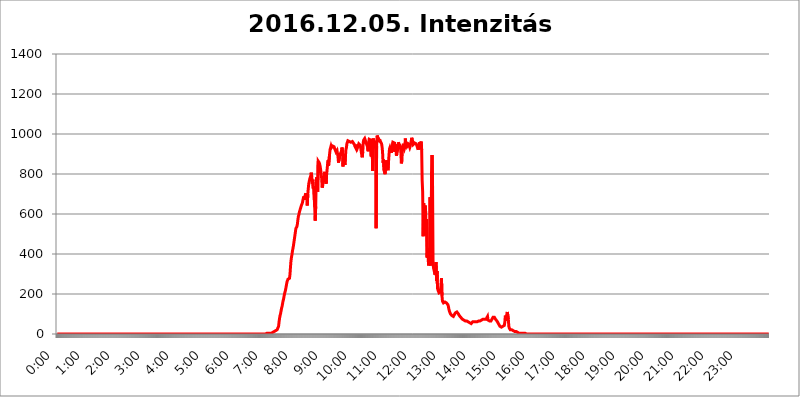
| Category | 2016.12.05. Intenzitás [W/m^2] |
|---|---|
| 0.0 | 0 |
| 0.0006944444444444445 | 0 |
| 0.001388888888888889 | 0 |
| 0.0020833333333333333 | 0 |
| 0.002777777777777778 | 0 |
| 0.003472222222222222 | 0 |
| 0.004166666666666667 | 0 |
| 0.004861111111111111 | 0 |
| 0.005555555555555556 | 0 |
| 0.0062499999999999995 | 0 |
| 0.006944444444444444 | 0 |
| 0.007638888888888889 | 0 |
| 0.008333333333333333 | 0 |
| 0.009027777777777779 | 0 |
| 0.009722222222222222 | 0 |
| 0.010416666666666666 | 0 |
| 0.011111111111111112 | 0 |
| 0.011805555555555555 | 0 |
| 0.012499999999999999 | 0 |
| 0.013194444444444444 | 0 |
| 0.013888888888888888 | 0 |
| 0.014583333333333332 | 0 |
| 0.015277777777777777 | 0 |
| 0.015972222222222224 | 0 |
| 0.016666666666666666 | 0 |
| 0.017361111111111112 | 0 |
| 0.018055555555555557 | 0 |
| 0.01875 | 0 |
| 0.019444444444444445 | 0 |
| 0.02013888888888889 | 0 |
| 0.020833333333333332 | 0 |
| 0.02152777777777778 | 0 |
| 0.022222222222222223 | 0 |
| 0.02291666666666667 | 0 |
| 0.02361111111111111 | 0 |
| 0.024305555555555556 | 0 |
| 0.024999999999999998 | 0 |
| 0.025694444444444447 | 0 |
| 0.02638888888888889 | 0 |
| 0.027083333333333334 | 0 |
| 0.027777777777777776 | 0 |
| 0.02847222222222222 | 0 |
| 0.029166666666666664 | 0 |
| 0.029861111111111113 | 0 |
| 0.030555555555555555 | 0 |
| 0.03125 | 0 |
| 0.03194444444444445 | 0 |
| 0.03263888888888889 | 0 |
| 0.03333333333333333 | 0 |
| 0.034027777777777775 | 0 |
| 0.034722222222222224 | 0 |
| 0.035416666666666666 | 0 |
| 0.036111111111111115 | 0 |
| 0.03680555555555556 | 0 |
| 0.0375 | 0 |
| 0.03819444444444444 | 0 |
| 0.03888888888888889 | 0 |
| 0.03958333333333333 | 0 |
| 0.04027777777777778 | 0 |
| 0.04097222222222222 | 0 |
| 0.041666666666666664 | 0 |
| 0.042361111111111106 | 0 |
| 0.04305555555555556 | 0 |
| 0.043750000000000004 | 0 |
| 0.044444444444444446 | 0 |
| 0.04513888888888889 | 0 |
| 0.04583333333333334 | 0 |
| 0.04652777777777778 | 0 |
| 0.04722222222222222 | 0 |
| 0.04791666666666666 | 0 |
| 0.04861111111111111 | 0 |
| 0.049305555555555554 | 0 |
| 0.049999999999999996 | 0 |
| 0.05069444444444445 | 0 |
| 0.051388888888888894 | 0 |
| 0.052083333333333336 | 0 |
| 0.05277777777777778 | 0 |
| 0.05347222222222222 | 0 |
| 0.05416666666666667 | 0 |
| 0.05486111111111111 | 0 |
| 0.05555555555555555 | 0 |
| 0.05625 | 0 |
| 0.05694444444444444 | 0 |
| 0.057638888888888885 | 0 |
| 0.05833333333333333 | 0 |
| 0.05902777777777778 | 0 |
| 0.059722222222222225 | 0 |
| 0.06041666666666667 | 0 |
| 0.061111111111111116 | 0 |
| 0.06180555555555556 | 0 |
| 0.0625 | 0 |
| 0.06319444444444444 | 0 |
| 0.06388888888888888 | 0 |
| 0.06458333333333334 | 0 |
| 0.06527777777777778 | 0 |
| 0.06597222222222222 | 0 |
| 0.06666666666666667 | 0 |
| 0.06736111111111111 | 0 |
| 0.06805555555555555 | 0 |
| 0.06874999999999999 | 0 |
| 0.06944444444444443 | 0 |
| 0.07013888888888889 | 0 |
| 0.07083333333333333 | 0 |
| 0.07152777777777779 | 0 |
| 0.07222222222222223 | 0 |
| 0.07291666666666667 | 0 |
| 0.07361111111111111 | 0 |
| 0.07430555555555556 | 0 |
| 0.075 | 0 |
| 0.07569444444444444 | 0 |
| 0.0763888888888889 | 0 |
| 0.07708333333333334 | 0 |
| 0.07777777777777778 | 0 |
| 0.07847222222222222 | 0 |
| 0.07916666666666666 | 0 |
| 0.0798611111111111 | 0 |
| 0.08055555555555556 | 0 |
| 0.08125 | 0 |
| 0.08194444444444444 | 0 |
| 0.08263888888888889 | 0 |
| 0.08333333333333333 | 0 |
| 0.08402777777777777 | 0 |
| 0.08472222222222221 | 0 |
| 0.08541666666666665 | 0 |
| 0.08611111111111112 | 0 |
| 0.08680555555555557 | 0 |
| 0.08750000000000001 | 0 |
| 0.08819444444444445 | 0 |
| 0.08888888888888889 | 0 |
| 0.08958333333333333 | 0 |
| 0.09027777777777778 | 0 |
| 0.09097222222222222 | 0 |
| 0.09166666666666667 | 0 |
| 0.09236111111111112 | 0 |
| 0.09305555555555556 | 0 |
| 0.09375 | 0 |
| 0.09444444444444444 | 0 |
| 0.09513888888888888 | 0 |
| 0.09583333333333333 | 0 |
| 0.09652777777777777 | 0 |
| 0.09722222222222222 | 0 |
| 0.09791666666666667 | 0 |
| 0.09861111111111111 | 0 |
| 0.09930555555555555 | 0 |
| 0.09999999999999999 | 0 |
| 0.10069444444444443 | 0 |
| 0.1013888888888889 | 0 |
| 0.10208333333333335 | 0 |
| 0.10277777777777779 | 0 |
| 0.10347222222222223 | 0 |
| 0.10416666666666667 | 0 |
| 0.10486111111111111 | 0 |
| 0.10555555555555556 | 0 |
| 0.10625 | 0 |
| 0.10694444444444444 | 0 |
| 0.1076388888888889 | 0 |
| 0.10833333333333334 | 0 |
| 0.10902777777777778 | 0 |
| 0.10972222222222222 | 0 |
| 0.1111111111111111 | 0 |
| 0.11180555555555556 | 0 |
| 0.11180555555555556 | 0 |
| 0.1125 | 0 |
| 0.11319444444444444 | 0 |
| 0.11388888888888889 | 0 |
| 0.11458333333333333 | 0 |
| 0.11527777777777777 | 0 |
| 0.11597222222222221 | 0 |
| 0.11666666666666665 | 0 |
| 0.1173611111111111 | 0 |
| 0.11805555555555557 | 0 |
| 0.11944444444444445 | 0 |
| 0.12013888888888889 | 0 |
| 0.12083333333333333 | 0 |
| 0.12152777777777778 | 0 |
| 0.12222222222222223 | 0 |
| 0.12291666666666667 | 0 |
| 0.12291666666666667 | 0 |
| 0.12361111111111112 | 0 |
| 0.12430555555555556 | 0 |
| 0.125 | 0 |
| 0.12569444444444444 | 0 |
| 0.12638888888888888 | 0 |
| 0.12708333333333333 | 0 |
| 0.16875 | 0 |
| 0.12847222222222224 | 0 |
| 0.12916666666666668 | 0 |
| 0.12986111111111112 | 0 |
| 0.13055555555555556 | 0 |
| 0.13125 | 0 |
| 0.13194444444444445 | 0 |
| 0.1326388888888889 | 0 |
| 0.13333333333333333 | 0 |
| 0.13402777777777777 | 0 |
| 0.13402777777777777 | 0 |
| 0.13472222222222222 | 0 |
| 0.13541666666666666 | 0 |
| 0.1361111111111111 | 0 |
| 0.13749999999999998 | 0 |
| 0.13819444444444443 | 0 |
| 0.1388888888888889 | 0 |
| 0.13958333333333334 | 0 |
| 0.14027777777777778 | 0 |
| 0.14097222222222222 | 0 |
| 0.14166666666666666 | 0 |
| 0.1423611111111111 | 0 |
| 0.14305555555555557 | 0 |
| 0.14375000000000002 | 0 |
| 0.14444444444444446 | 0 |
| 0.1451388888888889 | 0 |
| 0.1451388888888889 | 0 |
| 0.14652777777777778 | 0 |
| 0.14722222222222223 | 0 |
| 0.14791666666666667 | 0 |
| 0.1486111111111111 | 0 |
| 0.14930555555555555 | 0 |
| 0.15 | 0 |
| 0.15069444444444444 | 0 |
| 0.15138888888888888 | 0 |
| 0.15208333333333332 | 0 |
| 0.15277777777777776 | 0 |
| 0.15347222222222223 | 0 |
| 0.15416666666666667 | 0 |
| 0.15486111111111112 | 0 |
| 0.15555555555555556 | 0 |
| 0.15625 | 0 |
| 0.15694444444444444 | 0 |
| 0.15763888888888888 | 0 |
| 0.15833333333333333 | 0 |
| 0.15902777777777777 | 0 |
| 0.15972222222222224 | 0 |
| 0.16041666666666668 | 0 |
| 0.16111111111111112 | 0 |
| 0.16180555555555556 | 0 |
| 0.1625 | 0 |
| 0.16319444444444445 | 0 |
| 0.1638888888888889 | 0 |
| 0.16458333333333333 | 0 |
| 0.16527777777777777 | 0 |
| 0.16597222222222222 | 0 |
| 0.16666666666666666 | 0 |
| 0.1673611111111111 | 0 |
| 0.16805555555555554 | 0 |
| 0.16874999999999998 | 0 |
| 0.16944444444444443 | 0 |
| 0.17013888888888887 | 0 |
| 0.1708333333333333 | 0 |
| 0.17152777777777775 | 0 |
| 0.17222222222222225 | 0 |
| 0.1729166666666667 | 0 |
| 0.17361111111111113 | 0 |
| 0.17430555555555557 | 0 |
| 0.17500000000000002 | 0 |
| 0.17569444444444446 | 0 |
| 0.1763888888888889 | 0 |
| 0.17708333333333334 | 0 |
| 0.17777777777777778 | 0 |
| 0.17847222222222223 | 0 |
| 0.17916666666666667 | 0 |
| 0.1798611111111111 | 0 |
| 0.18055555555555555 | 0 |
| 0.18125 | 0 |
| 0.18194444444444444 | 0 |
| 0.1826388888888889 | 0 |
| 0.18333333333333335 | 0 |
| 0.1840277777777778 | 0 |
| 0.18472222222222223 | 0 |
| 0.18541666666666667 | 0 |
| 0.18611111111111112 | 0 |
| 0.18680555555555556 | 0 |
| 0.1875 | 0 |
| 0.18819444444444444 | 0 |
| 0.18888888888888888 | 0 |
| 0.18958333333333333 | 0 |
| 0.19027777777777777 | 0 |
| 0.1909722222222222 | 0 |
| 0.19166666666666665 | 0 |
| 0.19236111111111112 | 0 |
| 0.19305555555555554 | 0 |
| 0.19375 | 0 |
| 0.19444444444444445 | 0 |
| 0.1951388888888889 | 0 |
| 0.19583333333333333 | 0 |
| 0.19652777777777777 | 0 |
| 0.19722222222222222 | 0 |
| 0.19791666666666666 | 0 |
| 0.1986111111111111 | 0 |
| 0.19930555555555554 | 0 |
| 0.19999999999999998 | 0 |
| 0.20069444444444443 | 0 |
| 0.20138888888888887 | 0 |
| 0.2020833333333333 | 0 |
| 0.2027777777777778 | 0 |
| 0.2034722222222222 | 0 |
| 0.2041666666666667 | 0 |
| 0.20486111111111113 | 0 |
| 0.20555555555555557 | 0 |
| 0.20625000000000002 | 0 |
| 0.20694444444444446 | 0 |
| 0.2076388888888889 | 0 |
| 0.20833333333333334 | 0 |
| 0.20902777777777778 | 0 |
| 0.20972222222222223 | 0 |
| 0.21041666666666667 | 0 |
| 0.2111111111111111 | 0 |
| 0.21180555555555555 | 0 |
| 0.2125 | 0 |
| 0.21319444444444444 | 0 |
| 0.2138888888888889 | 0 |
| 0.21458333333333335 | 0 |
| 0.2152777777777778 | 0 |
| 0.21597222222222223 | 0 |
| 0.21666666666666667 | 0 |
| 0.21736111111111112 | 0 |
| 0.21805555555555556 | 0 |
| 0.21875 | 0 |
| 0.21944444444444444 | 0 |
| 0.22013888888888888 | 0 |
| 0.22083333333333333 | 0 |
| 0.22152777777777777 | 0 |
| 0.2222222222222222 | 0 |
| 0.22291666666666665 | 0 |
| 0.2236111111111111 | 0 |
| 0.22430555555555556 | 0 |
| 0.225 | 0 |
| 0.22569444444444445 | 0 |
| 0.2263888888888889 | 0 |
| 0.22708333333333333 | 0 |
| 0.22777777777777777 | 0 |
| 0.22847222222222222 | 0 |
| 0.22916666666666666 | 0 |
| 0.2298611111111111 | 0 |
| 0.23055555555555554 | 0 |
| 0.23124999999999998 | 0 |
| 0.23194444444444443 | 0 |
| 0.23263888888888887 | 0 |
| 0.2333333333333333 | 0 |
| 0.2340277777777778 | 0 |
| 0.2347222222222222 | 0 |
| 0.2354166666666667 | 0 |
| 0.23611111111111113 | 0 |
| 0.23680555555555557 | 0 |
| 0.23750000000000002 | 0 |
| 0.23819444444444446 | 0 |
| 0.2388888888888889 | 0 |
| 0.23958333333333334 | 0 |
| 0.24027777777777778 | 0 |
| 0.24097222222222223 | 0 |
| 0.24166666666666667 | 0 |
| 0.2423611111111111 | 0 |
| 0.24305555555555555 | 0 |
| 0.24375 | 0 |
| 0.24444444444444446 | 0 |
| 0.24513888888888888 | 0 |
| 0.24583333333333335 | 0 |
| 0.2465277777777778 | 0 |
| 0.24722222222222223 | 0 |
| 0.24791666666666667 | 0 |
| 0.24861111111111112 | 0 |
| 0.24930555555555556 | 0 |
| 0.25 | 0 |
| 0.25069444444444444 | 0 |
| 0.2513888888888889 | 0 |
| 0.2520833333333333 | 0 |
| 0.25277777777777777 | 0 |
| 0.2534722222222222 | 0 |
| 0.25416666666666665 | 0 |
| 0.2548611111111111 | 0 |
| 0.2555555555555556 | 0 |
| 0.25625000000000003 | 0 |
| 0.2569444444444445 | 0 |
| 0.2576388888888889 | 0 |
| 0.25833333333333336 | 0 |
| 0.2590277777777778 | 0 |
| 0.25972222222222224 | 0 |
| 0.2604166666666667 | 0 |
| 0.2611111111111111 | 0 |
| 0.26180555555555557 | 0 |
| 0.2625 | 0 |
| 0.26319444444444445 | 0 |
| 0.2638888888888889 | 0 |
| 0.26458333333333334 | 0 |
| 0.2652777777777778 | 0 |
| 0.2659722222222222 | 0 |
| 0.26666666666666666 | 0 |
| 0.2673611111111111 | 0 |
| 0.26805555555555555 | 0 |
| 0.26875 | 0 |
| 0.26944444444444443 | 0 |
| 0.2701388888888889 | 0 |
| 0.2708333333333333 | 0 |
| 0.27152777777777776 | 0 |
| 0.2722222222222222 | 0 |
| 0.27291666666666664 | 0 |
| 0.2736111111111111 | 0 |
| 0.2743055555555555 | 0 |
| 0.27499999999999997 | 0 |
| 0.27569444444444446 | 0 |
| 0.27638888888888885 | 0 |
| 0.27708333333333335 | 0 |
| 0.2777777777777778 | 0 |
| 0.27847222222222223 | 0 |
| 0.2791666666666667 | 0 |
| 0.2798611111111111 | 0 |
| 0.28055555555555556 | 0 |
| 0.28125 | 0 |
| 0.28194444444444444 | 0 |
| 0.2826388888888889 | 0 |
| 0.2833333333333333 | 0 |
| 0.28402777777777777 | 0 |
| 0.2847222222222222 | 0 |
| 0.28541666666666665 | 0 |
| 0.28611111111111115 | 0 |
| 0.28680555555555554 | 0 |
| 0.28750000000000003 | 0 |
| 0.2881944444444445 | 0 |
| 0.2888888888888889 | 0 |
| 0.28958333333333336 | 0 |
| 0.2902777777777778 | 0 |
| 0.29097222222222224 | 0 |
| 0.2916666666666667 | 0 |
| 0.2923611111111111 | 0 |
| 0.29305555555555557 | 3.525 |
| 0.29375 | 3.525 |
| 0.29444444444444445 | 3.525 |
| 0.2951388888888889 | 3.525 |
| 0.29583333333333334 | 3.525 |
| 0.2965277777777778 | 3.525 |
| 0.2972222222222222 | 3.525 |
| 0.29791666666666666 | 3.525 |
| 0.2986111111111111 | 3.525 |
| 0.29930555555555555 | 3.525 |
| 0.3 | 3.525 |
| 0.30069444444444443 | 3.525 |
| 0.3013888888888889 | 7.887 |
| 0.3020833333333333 | 7.887 |
| 0.30277777777777776 | 7.887 |
| 0.3034722222222222 | 12.257 |
| 0.30416666666666664 | 12.257 |
| 0.3048611111111111 | 12.257 |
| 0.3055555555555555 | 12.257 |
| 0.30624999999999997 | 16.636 |
| 0.3069444444444444 | 16.636 |
| 0.3076388888888889 | 21.024 |
| 0.30833333333333335 | 21.024 |
| 0.3090277777777778 | 21.024 |
| 0.30972222222222223 | 25.419 |
| 0.3104166666666667 | 38.653 |
| 0.3111111111111111 | 60.85 |
| 0.31180555555555556 | 78.722 |
| 0.3125 | 92.184 |
| 0.31319444444444444 | 101.184 |
| 0.3138888888888889 | 114.716 |
| 0.3145833333333333 | 128.284 |
| 0.31527777777777777 | 137.347 |
| 0.3159722222222222 | 150.964 |
| 0.31666666666666665 | 164.605 |
| 0.31736111111111115 | 173.709 |
| 0.31805555555555554 | 187.378 |
| 0.31875000000000003 | 201.058 |
| 0.3194444444444445 | 210.182 |
| 0.3201388888888889 | 219.309 |
| 0.32083333333333336 | 233 |
| 0.3215277777777778 | 246.689 |
| 0.32222222222222224 | 260.373 |
| 0.3229166666666667 | 264.932 |
| 0.3236111111111111 | 274.047 |
| 0.32430555555555557 | 278.603 |
| 0.325 | 278.603 |
| 0.32569444444444445 | 278.603 |
| 0.3263888888888889 | 296.808 |
| 0.32708333333333334 | 333.113 |
| 0.3277777777777778 | 364.728 |
| 0.3284722222222222 | 382.715 |
| 0.32916666666666666 | 396.164 |
| 0.3298611111111111 | 414.035 |
| 0.33055555555555555 | 427.39 |
| 0.33125 | 440.702 |
| 0.33194444444444443 | 458.38 |
| 0.3326388888888889 | 475.972 |
| 0.3333333333333333 | 493.475 |
| 0.3340277777777778 | 510.885 |
| 0.3347222222222222 | 528.2 |
| 0.3354166666666667 | 532.513 |
| 0.3361111111111111 | 536.82 |
| 0.3368055555555556 | 549.704 |
| 0.33749999999999997 | 571.049 |
| 0.33819444444444446 | 588.009 |
| 0.33888888888888885 | 596.45 |
| 0.33958333333333335 | 609.062 |
| 0.34027777777777773 | 613.252 |
| 0.34097222222222223 | 625.784 |
| 0.3416666666666666 | 634.105 |
| 0.3423611111111111 | 642.4 |
| 0.3430555555555555 | 646.537 |
| 0.34375 | 654.791 |
| 0.3444444444444445 | 658.909 |
| 0.3451388888888889 | 679.395 |
| 0.3458333333333334 | 687.544 |
| 0.34652777777777777 | 671.22 |
| 0.34722222222222227 | 687.544 |
| 0.34791666666666665 | 695.666 |
| 0.34861111111111115 | 703.762 |
| 0.34930555555555554 | 699.717 |
| 0.35000000000000003 | 675.311 |
| 0.3506944444444444 | 642.4 |
| 0.3513888888888889 | 699.717 |
| 0.3520833333333333 | 727.896 |
| 0.3527777777777778 | 751.803 |
| 0.3534722222222222 | 763.674 |
| 0.3541666666666667 | 775.492 |
| 0.3548611111111111 | 783.342 |
| 0.35555555555555557 | 791.169 |
| 0.35625 | 806.757 |
| 0.35694444444444445 | 787.258 |
| 0.3576388888888889 | 751.803 |
| 0.35833333333333334 | 771.559 |
| 0.3590277777777778 | 727.896 |
| 0.3597222222222222 | 739.877 |
| 0.36041666666666666 | 735.89 |
| 0.3611111111111111 | 634.105 |
| 0.36180555555555555 | 566.793 |
| 0.3625 | 638.256 |
| 0.36319444444444443 | 767.62 |
| 0.3638888888888889 | 783.342 |
| 0.3645833333333333 | 735.89 |
| 0.3652777777777778 | 711.832 |
| 0.3659722222222222 | 864.493 |
| 0.3666666666666667 | 860.676 |
| 0.3673611111111111 | 856.855 |
| 0.3680555555555556 | 849.199 |
| 0.36874999999999997 | 837.682 |
| 0.36944444444444446 | 837.682 |
| 0.37013888888888885 | 802.868 |
| 0.37083333333333335 | 779.42 |
| 0.37152777777777773 | 731.896 |
| 0.37222222222222223 | 739.877 |
| 0.3729166666666666 | 759.723 |
| 0.3736111111111111 | 775.492 |
| 0.3743055555555555 | 759.723 |
| 0.375 | 810.641 |
| 0.3756944444444445 | 759.723 |
| 0.3763888888888889 | 791.169 |
| 0.3770833333333334 | 751.803 |
| 0.37777777777777777 | 795.074 |
| 0.37847222222222227 | 791.169 |
| 0.37916666666666665 | 849.199 |
| 0.37986111111111115 | 868.305 |
| 0.38055555555555554 | 841.526 |
| 0.38125000000000003 | 837.682 |
| 0.3819444444444444 | 898.668 |
| 0.3826388888888889 | 921.298 |
| 0.3833333333333333 | 921.298 |
| 0.3840277777777778 | 940.082 |
| 0.3847222222222222 | 932.576 |
| 0.3854166666666667 | 932.576 |
| 0.3861111111111111 | 940.082 |
| 0.38680555555555557 | 936.33 |
| 0.3875 | 936.33 |
| 0.38819444444444445 | 936.33 |
| 0.3888888888888889 | 928.819 |
| 0.38958333333333334 | 928.819 |
| 0.3902777777777778 | 932.576 |
| 0.3909722222222222 | 909.996 |
| 0.39166666666666666 | 909.996 |
| 0.3923611111111111 | 917.534 |
| 0.39305555555555555 | 917.534 |
| 0.39375 | 887.309 |
| 0.39444444444444443 | 856.855 |
| 0.3951388888888889 | 872.114 |
| 0.3958333333333333 | 898.668 |
| 0.3965277777777778 | 891.099 |
| 0.3972222222222222 | 902.447 |
| 0.3979166666666667 | 902.447 |
| 0.3986111111111111 | 913.766 |
| 0.3993055555555556 | 932.576 |
| 0.39999999999999997 | 921.298 |
| 0.40069444444444446 | 837.682 |
| 0.40138888888888885 | 887.309 |
| 0.40208333333333335 | 879.719 |
| 0.40277777777777773 | 860.676 |
| 0.40347222222222223 | 845.365 |
| 0.4041666666666666 | 887.309 |
| 0.4048611111111111 | 921.298 |
| 0.4055555555555555 | 932.576 |
| 0.40625 | 951.327 |
| 0.4069444444444445 | 955.071 |
| 0.4076388888888889 | 966.295 |
| 0.4083333333333334 | 966.295 |
| 0.40902777777777777 | 966.295 |
| 0.40972222222222227 | 962.555 |
| 0.41041666666666665 | 962.555 |
| 0.41111111111111115 | 958.814 |
| 0.41180555555555554 | 958.814 |
| 0.41250000000000003 | 955.071 |
| 0.4131944444444444 | 962.555 |
| 0.4138888888888889 | 962.555 |
| 0.4145833333333333 | 958.814 |
| 0.4152777777777778 | 955.071 |
| 0.4159722222222222 | 951.327 |
| 0.4166666666666667 | 947.58 |
| 0.4173611111111111 | 940.082 |
| 0.41805555555555557 | 940.082 |
| 0.41875 | 940.082 |
| 0.41944444444444445 | 925.06 |
| 0.4201388888888889 | 936.33 |
| 0.42083333333333334 | 947.58 |
| 0.4215277777777778 | 936.33 |
| 0.4222222222222222 | 940.082 |
| 0.42291666666666666 | 951.327 |
| 0.4236111111111111 | 951.327 |
| 0.42430555555555555 | 947.58 |
| 0.425 | 943.832 |
| 0.42569444444444443 | 947.58 |
| 0.4263888888888889 | 940.082 |
| 0.4270833333333333 | 894.885 |
| 0.4277777777777778 | 883.516 |
| 0.4284722222222222 | 909.996 |
| 0.4291666666666667 | 958.814 |
| 0.4298611111111111 | 970.034 |
| 0.4305555555555556 | 973.772 |
| 0.43124999999999997 | 977.508 |
| 0.43194444444444446 | 977.508 |
| 0.43263888888888885 | 973.772 |
| 0.43333333333333335 | 955.071 |
| 0.43402777777777773 | 947.58 |
| 0.43472222222222223 | 940.082 |
| 0.4354166666666666 | 947.58 |
| 0.4361111111111111 | 913.766 |
| 0.4368055555555555 | 958.814 |
| 0.4375 | 973.772 |
| 0.4381944444444445 | 970.034 |
| 0.4388888888888889 | 977.508 |
| 0.4395833333333334 | 970.034 |
| 0.44027777777777777 | 887.309 |
| 0.44097222222222227 | 958.814 |
| 0.44166666666666665 | 928.819 |
| 0.44236111111111115 | 814.519 |
| 0.44305555555555554 | 977.508 |
| 0.44375000000000003 | 958.814 |
| 0.4444444444444444 | 928.819 |
| 0.4451388888888889 | 947.58 |
| 0.4458333333333333 | 966.295 |
| 0.4465277777777778 | 947.58 |
| 0.4472222222222222 | 528.2 |
| 0.4479166666666667 | 940.082 |
| 0.4486111111111111 | 992.448 |
| 0.44930555555555557 | 984.98 |
| 0.45 | 988.714 |
| 0.45069444444444445 | 977.508 |
| 0.4513888888888889 | 958.814 |
| 0.45208333333333334 | 973.772 |
| 0.4527777777777778 | 966.295 |
| 0.4534722222222222 | 962.555 |
| 0.45416666666666666 | 962.555 |
| 0.4548611111111111 | 951.327 |
| 0.45555555555555555 | 936.33 |
| 0.45625 | 909.996 |
| 0.45694444444444443 | 856.855 |
| 0.4576388888888889 | 872.114 |
| 0.4583333333333333 | 818.392 |
| 0.4590277777777778 | 814.519 |
| 0.4597222222222222 | 798.974 |
| 0.4604166666666667 | 822.26 |
| 0.4611111111111111 | 833.834 |
| 0.4618055555555556 | 868.305 |
| 0.46249999999999997 | 845.365 |
| 0.46319444444444446 | 826.123 |
| 0.46388888888888885 | 818.392 |
| 0.46458333333333335 | 856.855 |
| 0.46527777777777773 | 894.885 |
| 0.46597222222222223 | 925.06 |
| 0.4666666666666666 | 932.576 |
| 0.4673611111111111 | 925.06 |
| 0.4680555555555555 | 921.298 |
| 0.46875 | 906.223 |
| 0.4694444444444445 | 909.996 |
| 0.4701388888888889 | 906.223 |
| 0.4708333333333334 | 958.814 |
| 0.47152777777777777 | 958.814 |
| 0.47222222222222227 | 955.071 |
| 0.47291666666666665 | 955.071 |
| 0.47361111111111115 | 909.996 |
| 0.47430555555555554 | 947.58 |
| 0.47500000000000003 | 928.819 |
| 0.4756944444444444 | 891.099 |
| 0.4763888888888889 | 902.447 |
| 0.4770833333333333 | 906.223 |
| 0.4777777777777778 | 925.06 |
| 0.4784722222222222 | 958.814 |
| 0.4791666666666667 | 951.327 |
| 0.4798611111111111 | 955.071 |
| 0.48055555555555557 | 951.327 |
| 0.48125 | 940.082 |
| 0.48194444444444445 | 906.223 |
| 0.4826388888888889 | 853.029 |
| 0.48333333333333334 | 864.493 |
| 0.4840277777777778 | 913.766 |
| 0.4847222222222222 | 917.534 |
| 0.48541666666666666 | 951.327 |
| 0.4861111111111111 | 932.576 |
| 0.48680555555555555 | 925.06 |
| 0.4875 | 932.576 |
| 0.48819444444444443 | 977.508 |
| 0.4888888888888889 | 955.071 |
| 0.4895833333333333 | 932.576 |
| 0.4902777777777778 | 958.814 |
| 0.4909722222222222 | 940.082 |
| 0.4916666666666667 | 936.33 |
| 0.4923611111111111 | 947.58 |
| 0.4930555555555556 | 951.327 |
| 0.49374999999999997 | 940.082 |
| 0.49444444444444446 | 932.576 |
| 0.49513888888888885 | 940.082 |
| 0.49583333333333335 | 955.071 |
| 0.49652777777777773 | 966.295 |
| 0.49722222222222223 | 981.244 |
| 0.4979166666666666 | 970.034 |
| 0.4986111111111111 | 962.555 |
| 0.4993055555555555 | 947.58 |
| 0.5 | 947.58 |
| 0.5006944444444444 | 951.327 |
| 0.5013888888888889 | 955.071 |
| 0.5020833333333333 | 955.071 |
| 0.5027777777777778 | 958.814 |
| 0.5034722222222222 | 951.327 |
| 0.5041666666666667 | 943.832 |
| 0.5048611111111111 | 940.082 |
| 0.5055555555555555 | 943.832 |
| 0.50625 | 921.298 |
| 0.5069444444444444 | 936.33 |
| 0.5076388888888889 | 940.082 |
| 0.5083333333333333 | 958.814 |
| 0.5090277777777777 | 947.58 |
| 0.5097222222222222 | 955.071 |
| 0.5104166666666666 | 962.555 |
| 0.5111111111111112 | 921.298 |
| 0.5118055555555555 | 767.62 |
| 0.5125000000000001 | 711.832 |
| 0.5131944444444444 | 489.108 |
| 0.513888888888889 | 654.791 |
| 0.5145833333333333 | 493.475 |
| 0.5152777777777778 | 523.88 |
| 0.5159722222222222 | 642.4 |
| 0.5166666666666667 | 613.252 |
| 0.517361111111111 | 493.475 |
| 0.5180555555555556 | 575.299 |
| 0.5187499999999999 | 382.715 |
| 0.5194444444444445 | 427.39 |
| 0.5201388888888888 | 382.715 |
| 0.5208333333333334 | 342.162 |
| 0.5215277777777778 | 355.712 |
| 0.5222222222222223 | 387.202 |
| 0.5229166666666667 | 683.473 |
| 0.5236111111111111 | 351.198 |
| 0.5243055555555556 | 342.162 |
| 0.525 | 810.641 |
| 0.5256944444444445 | 894.885 |
| 0.5263888888888889 | 731.896 |
| 0.5270833333333333 | 351.198 |
| 0.5277777777777778 | 328.584 |
| 0.5284722222222222 | 319.517 |
| 0.5291666666666667 | 324.052 |
| 0.5298611111111111 | 296.808 |
| 0.5305555555555556 | 324.052 |
| 0.53125 | 360.221 |
| 0.5319444444444444 | 264.932 |
| 0.5326388888888889 | 314.98 |
| 0.5333333333333333 | 228.436 |
| 0.5340277777777778 | 219.309 |
| 0.5347222222222222 | 214.746 |
| 0.5354166666666667 | 205.62 |
| 0.5361111111111111 | 201.058 |
| 0.5368055555555555 | 201.058 |
| 0.5375 | 210.182 |
| 0.5381944444444444 | 205.62 |
| 0.5388888888888889 | 278.603 |
| 0.5395833333333333 | 191.937 |
| 0.5402777777777777 | 164.605 |
| 0.5409722222222222 | 160.056 |
| 0.5416666666666666 | 155.509 |
| 0.5423611111111112 | 155.509 |
| 0.5430555555555555 | 155.509 |
| 0.5437500000000001 | 160.056 |
| 0.5444444444444444 | 164.605 |
| 0.545138888888889 | 160.056 |
| 0.5458333333333333 | 155.509 |
| 0.5465277777777778 | 155.509 |
| 0.5472222222222222 | 150.964 |
| 0.5479166666666667 | 146.423 |
| 0.548611111111111 | 137.347 |
| 0.5493055555555556 | 123.758 |
| 0.5499999999999999 | 114.716 |
| 0.5506944444444445 | 110.201 |
| 0.5513888888888888 | 101.184 |
| 0.5520833333333334 | 101.184 |
| 0.5527777777777778 | 96.682 |
| 0.5534722222222223 | 92.184 |
| 0.5541666666666667 | 87.692 |
| 0.5548611111111111 | 87.692 |
| 0.5555555555555556 | 87.692 |
| 0.55625 | 92.184 |
| 0.5569444444444445 | 96.682 |
| 0.5576388888888889 | 101.184 |
| 0.5583333333333333 | 105.69 |
| 0.5590277777777778 | 110.201 |
| 0.5597222222222222 | 110.201 |
| 0.5604166666666667 | 110.201 |
| 0.5611111111111111 | 110.201 |
| 0.5618055555555556 | 105.69 |
| 0.5625 | 101.184 |
| 0.5631944444444444 | 96.682 |
| 0.5638888888888889 | 92.184 |
| 0.5645833333333333 | 87.692 |
| 0.5652777777777778 | 87.692 |
| 0.5659722222222222 | 83.205 |
| 0.5666666666666667 | 83.205 |
| 0.5673611111111111 | 78.722 |
| 0.5680555555555555 | 74.246 |
| 0.56875 | 74.246 |
| 0.5694444444444444 | 69.775 |
| 0.5701388888888889 | 69.775 |
| 0.5708333333333333 | 65.31 |
| 0.5715277777777777 | 65.31 |
| 0.5722222222222222 | 65.31 |
| 0.5729166666666666 | 65.31 |
| 0.5736111111111112 | 65.31 |
| 0.5743055555555555 | 65.31 |
| 0.5750000000000001 | 60.85 |
| 0.5756944444444444 | 60.85 |
| 0.576388888888889 | 60.85 |
| 0.5770833333333333 | 56.398 |
| 0.5777777777777778 | 56.398 |
| 0.5784722222222222 | 56.398 |
| 0.5791666666666667 | 51.951 |
| 0.579861111111111 | 51.951 |
| 0.5805555555555556 | 51.951 |
| 0.5812499999999999 | 56.398 |
| 0.5819444444444445 | 56.398 |
| 0.5826388888888888 | 60.85 |
| 0.5833333333333334 | 60.85 |
| 0.5840277777777778 | 60.85 |
| 0.5847222222222223 | 60.85 |
| 0.5854166666666667 | 60.85 |
| 0.5861111111111111 | 60.85 |
| 0.5868055555555556 | 60.85 |
| 0.5875 | 60.85 |
| 0.5881944444444445 | 60.85 |
| 0.5888888888888889 | 60.85 |
| 0.5895833333333333 | 60.85 |
| 0.5902777777777778 | 60.85 |
| 0.5909722222222222 | 65.31 |
| 0.5916666666666667 | 65.31 |
| 0.5923611111111111 | 65.31 |
| 0.5930555555555556 | 65.31 |
| 0.59375 | 65.31 |
| 0.5944444444444444 | 69.775 |
| 0.5951388888888889 | 69.775 |
| 0.5958333333333333 | 74.246 |
| 0.5965277777777778 | 74.246 |
| 0.5972222222222222 | 74.246 |
| 0.5979166666666667 | 74.246 |
| 0.5986111111111111 | 74.246 |
| 0.5993055555555555 | 74.246 |
| 0.6 | 74.246 |
| 0.6006944444444444 | 74.246 |
| 0.6013888888888889 | 74.246 |
| 0.6020833333333333 | 69.775 |
| 0.6027777777777777 | 69.775 |
| 0.6034722222222222 | 87.692 |
| 0.6041666666666666 | 69.775 |
| 0.6048611111111112 | 69.775 |
| 0.6055555555555555 | 65.31 |
| 0.6062500000000001 | 65.31 |
| 0.6069444444444444 | 65.31 |
| 0.607638888888889 | 65.31 |
| 0.6083333333333333 | 65.31 |
| 0.6090277777777778 | 69.775 |
| 0.6097222222222222 | 74.246 |
| 0.6104166666666667 | 78.722 |
| 0.611111111111111 | 83.205 |
| 0.6118055555555556 | 83.205 |
| 0.6124999999999999 | 83.205 |
| 0.6131944444444445 | 83.205 |
| 0.6138888888888888 | 78.722 |
| 0.6145833333333334 | 74.246 |
| 0.6152777777777778 | 74.246 |
| 0.6159722222222223 | 69.775 |
| 0.6166666666666667 | 65.31 |
| 0.6173611111111111 | 60.85 |
| 0.6180555555555556 | 56.398 |
| 0.61875 | 51.951 |
| 0.6194444444444445 | 47.511 |
| 0.6201388888888889 | 43.079 |
| 0.6208333333333333 | 38.653 |
| 0.6215277777777778 | 38.653 |
| 0.6222222222222222 | 34.234 |
| 0.6229166666666667 | 34.234 |
| 0.6236111111111111 | 34.234 |
| 0.6243055555555556 | 34.234 |
| 0.625 | 38.653 |
| 0.6256944444444444 | 38.653 |
| 0.6263888888888889 | 38.653 |
| 0.6270833333333333 | 43.079 |
| 0.6277777777777778 | 60.85 |
| 0.6284722222222222 | 92.184 |
| 0.6291666666666667 | 96.682 |
| 0.6298611111111111 | 65.31 |
| 0.6305555555555555 | 69.775 |
| 0.63125 | 110.201 |
| 0.6319444444444444 | 110.201 |
| 0.6326388888888889 | 74.246 |
| 0.6333333333333333 | 38.653 |
| 0.6340277777777777 | 29.823 |
| 0.6347222222222222 | 25.419 |
| 0.6354166666666666 | 21.024 |
| 0.6361111111111112 | 21.024 |
| 0.6368055555555555 | 21.024 |
| 0.6375000000000001 | 21.024 |
| 0.6381944444444444 | 16.636 |
| 0.638888888888889 | 16.636 |
| 0.6395833333333333 | 16.636 |
| 0.6402777777777778 | 16.636 |
| 0.6409722222222222 | 16.636 |
| 0.6416666666666667 | 12.257 |
| 0.642361111111111 | 12.257 |
| 0.6430555555555556 | 12.257 |
| 0.6437499999999999 | 12.257 |
| 0.6444444444444445 | 12.257 |
| 0.6451388888888888 | 7.887 |
| 0.6458333333333334 | 7.887 |
| 0.6465277777777778 | 7.887 |
| 0.6472222222222223 | 7.887 |
| 0.6479166666666667 | 3.525 |
| 0.6486111111111111 | 3.525 |
| 0.6493055555555556 | 3.525 |
| 0.65 | 3.525 |
| 0.6506944444444445 | 3.525 |
| 0.6513888888888889 | 3.525 |
| 0.6520833333333333 | 3.525 |
| 0.6527777777777778 | 3.525 |
| 0.6534722222222222 | 3.525 |
| 0.6541666666666667 | 3.525 |
| 0.6548611111111111 | 3.525 |
| 0.6555555555555556 | 3.525 |
| 0.65625 | 3.525 |
| 0.6569444444444444 | 3.525 |
| 0.6576388888888889 | 0 |
| 0.6583333333333333 | 0 |
| 0.6590277777777778 | 0 |
| 0.6597222222222222 | 0 |
| 0.6604166666666667 | 0 |
| 0.6611111111111111 | 0 |
| 0.6618055555555555 | 0 |
| 0.6625 | 0 |
| 0.6631944444444444 | 0 |
| 0.6638888888888889 | 0 |
| 0.6645833333333333 | 0 |
| 0.6652777777777777 | 0 |
| 0.6659722222222222 | 0 |
| 0.6666666666666666 | 0 |
| 0.6673611111111111 | 0 |
| 0.6680555555555556 | 0 |
| 0.6687500000000001 | 0 |
| 0.6694444444444444 | 0 |
| 0.6701388888888888 | 0 |
| 0.6708333333333334 | 0 |
| 0.6715277777777778 | 0 |
| 0.6722222222222222 | 0 |
| 0.6729166666666666 | 0 |
| 0.6736111111111112 | 0 |
| 0.6743055555555556 | 0 |
| 0.6749999999999999 | 0 |
| 0.6756944444444444 | 0 |
| 0.6763888888888889 | 0 |
| 0.6770833333333334 | 0 |
| 0.6777777777777777 | 0 |
| 0.6784722222222223 | 0 |
| 0.6791666666666667 | 0 |
| 0.6798611111111111 | 0 |
| 0.6805555555555555 | 0 |
| 0.68125 | 0 |
| 0.6819444444444445 | 0 |
| 0.6826388888888889 | 0 |
| 0.6833333333333332 | 0 |
| 0.6840277777777778 | 0 |
| 0.6847222222222222 | 0 |
| 0.6854166666666667 | 0 |
| 0.686111111111111 | 0 |
| 0.6868055555555556 | 0 |
| 0.6875 | 0 |
| 0.6881944444444444 | 0 |
| 0.688888888888889 | 0 |
| 0.6895833333333333 | 0 |
| 0.6902777777777778 | 0 |
| 0.6909722222222222 | 0 |
| 0.6916666666666668 | 0 |
| 0.6923611111111111 | 0 |
| 0.6930555555555555 | 0 |
| 0.69375 | 0 |
| 0.6944444444444445 | 0 |
| 0.6951388888888889 | 0 |
| 0.6958333333333333 | 0 |
| 0.6965277777777777 | 0 |
| 0.6972222222222223 | 0 |
| 0.6979166666666666 | 0 |
| 0.6986111111111111 | 0 |
| 0.6993055555555556 | 0 |
| 0.7000000000000001 | 0 |
| 0.7006944444444444 | 0 |
| 0.7013888888888888 | 0 |
| 0.7020833333333334 | 0 |
| 0.7027777777777778 | 0 |
| 0.7034722222222222 | 0 |
| 0.7041666666666666 | 0 |
| 0.7048611111111112 | 0 |
| 0.7055555555555556 | 0 |
| 0.7062499999999999 | 0 |
| 0.7069444444444444 | 0 |
| 0.7076388888888889 | 0 |
| 0.7083333333333334 | 0 |
| 0.7090277777777777 | 0 |
| 0.7097222222222223 | 0 |
| 0.7104166666666667 | 0 |
| 0.7111111111111111 | 0 |
| 0.7118055555555555 | 0 |
| 0.7125 | 0 |
| 0.7131944444444445 | 0 |
| 0.7138888888888889 | 0 |
| 0.7145833333333332 | 0 |
| 0.7152777777777778 | 0 |
| 0.7159722222222222 | 0 |
| 0.7166666666666667 | 0 |
| 0.717361111111111 | 0 |
| 0.7180555555555556 | 0 |
| 0.71875 | 0 |
| 0.7194444444444444 | 0 |
| 0.720138888888889 | 0 |
| 0.7208333333333333 | 0 |
| 0.7215277777777778 | 0 |
| 0.7222222222222222 | 0 |
| 0.7229166666666668 | 0 |
| 0.7236111111111111 | 0 |
| 0.7243055555555555 | 0 |
| 0.725 | 0 |
| 0.7256944444444445 | 0 |
| 0.7263888888888889 | 0 |
| 0.7270833333333333 | 0 |
| 0.7277777777777777 | 0 |
| 0.7284722222222223 | 0 |
| 0.7291666666666666 | 0 |
| 0.7298611111111111 | 0 |
| 0.7305555555555556 | 0 |
| 0.7312500000000001 | 0 |
| 0.7319444444444444 | 0 |
| 0.7326388888888888 | 0 |
| 0.7333333333333334 | 0 |
| 0.7340277777777778 | 0 |
| 0.7347222222222222 | 0 |
| 0.7354166666666666 | 0 |
| 0.7361111111111112 | 0 |
| 0.7368055555555556 | 0 |
| 0.7374999999999999 | 0 |
| 0.7381944444444444 | 0 |
| 0.7388888888888889 | 0 |
| 0.7395833333333334 | 0 |
| 0.7402777777777777 | 0 |
| 0.7409722222222223 | 0 |
| 0.7416666666666667 | 0 |
| 0.7423611111111111 | 0 |
| 0.7430555555555555 | 0 |
| 0.74375 | 0 |
| 0.7444444444444445 | 0 |
| 0.7451388888888889 | 0 |
| 0.7458333333333332 | 0 |
| 0.7465277777777778 | 0 |
| 0.7472222222222222 | 0 |
| 0.7479166666666667 | 0 |
| 0.748611111111111 | 0 |
| 0.7493055555555556 | 0 |
| 0.75 | 0 |
| 0.7506944444444444 | 0 |
| 0.751388888888889 | 0 |
| 0.7520833333333333 | 0 |
| 0.7527777777777778 | 0 |
| 0.7534722222222222 | 0 |
| 0.7541666666666668 | 0 |
| 0.7548611111111111 | 0 |
| 0.7555555555555555 | 0 |
| 0.75625 | 0 |
| 0.7569444444444445 | 0 |
| 0.7576388888888889 | 0 |
| 0.7583333333333333 | 0 |
| 0.7590277777777777 | 0 |
| 0.7597222222222223 | 0 |
| 0.7604166666666666 | 0 |
| 0.7611111111111111 | 0 |
| 0.7618055555555556 | 0 |
| 0.7625000000000001 | 0 |
| 0.7631944444444444 | 0 |
| 0.7638888888888888 | 0 |
| 0.7645833333333334 | 0 |
| 0.7652777777777778 | 0 |
| 0.7659722222222222 | 0 |
| 0.7666666666666666 | 0 |
| 0.7673611111111112 | 0 |
| 0.7680555555555556 | 0 |
| 0.7687499999999999 | 0 |
| 0.7694444444444444 | 0 |
| 0.7701388888888889 | 0 |
| 0.7708333333333334 | 0 |
| 0.7715277777777777 | 0 |
| 0.7722222222222223 | 0 |
| 0.7729166666666667 | 0 |
| 0.7736111111111111 | 0 |
| 0.7743055555555555 | 0 |
| 0.775 | 0 |
| 0.7756944444444445 | 0 |
| 0.7763888888888889 | 0 |
| 0.7770833333333332 | 0 |
| 0.7777777777777778 | 0 |
| 0.7784722222222222 | 0 |
| 0.7791666666666667 | 0 |
| 0.779861111111111 | 0 |
| 0.7805555555555556 | 0 |
| 0.78125 | 0 |
| 0.7819444444444444 | 0 |
| 0.782638888888889 | 0 |
| 0.7833333333333333 | 0 |
| 0.7840277777777778 | 0 |
| 0.7847222222222222 | 0 |
| 0.7854166666666668 | 0 |
| 0.7861111111111111 | 0 |
| 0.7868055555555555 | 0 |
| 0.7875 | 0 |
| 0.7881944444444445 | 0 |
| 0.7888888888888889 | 0 |
| 0.7895833333333333 | 0 |
| 0.7902777777777777 | 0 |
| 0.7909722222222223 | 0 |
| 0.7916666666666666 | 0 |
| 0.7923611111111111 | 0 |
| 0.7930555555555556 | 0 |
| 0.7937500000000001 | 0 |
| 0.7944444444444444 | 0 |
| 0.7951388888888888 | 0 |
| 0.7958333333333334 | 0 |
| 0.7965277777777778 | 0 |
| 0.7972222222222222 | 0 |
| 0.7979166666666666 | 0 |
| 0.7986111111111112 | 0 |
| 0.7993055555555556 | 0 |
| 0.7999999999999999 | 0 |
| 0.8006944444444444 | 0 |
| 0.8013888888888889 | 0 |
| 0.8020833333333334 | 0 |
| 0.8027777777777777 | 0 |
| 0.8034722222222223 | 0 |
| 0.8041666666666667 | 0 |
| 0.8048611111111111 | 0 |
| 0.8055555555555555 | 0 |
| 0.80625 | 0 |
| 0.8069444444444445 | 0 |
| 0.8076388888888889 | 0 |
| 0.8083333333333332 | 0 |
| 0.8090277777777778 | 0 |
| 0.8097222222222222 | 0 |
| 0.8104166666666667 | 0 |
| 0.811111111111111 | 0 |
| 0.8118055555555556 | 0 |
| 0.8125 | 0 |
| 0.8131944444444444 | 0 |
| 0.813888888888889 | 0 |
| 0.8145833333333333 | 0 |
| 0.8152777777777778 | 0 |
| 0.8159722222222222 | 0 |
| 0.8166666666666668 | 0 |
| 0.8173611111111111 | 0 |
| 0.8180555555555555 | 0 |
| 0.81875 | 0 |
| 0.8194444444444445 | 0 |
| 0.8201388888888889 | 0 |
| 0.8208333333333333 | 0 |
| 0.8215277777777777 | 0 |
| 0.8222222222222223 | 0 |
| 0.8229166666666666 | 0 |
| 0.8236111111111111 | 0 |
| 0.8243055555555556 | 0 |
| 0.8250000000000001 | 0 |
| 0.8256944444444444 | 0 |
| 0.8263888888888888 | 0 |
| 0.8270833333333334 | 0 |
| 0.8277777777777778 | 0 |
| 0.8284722222222222 | 0 |
| 0.8291666666666666 | 0 |
| 0.8298611111111112 | 0 |
| 0.8305555555555556 | 0 |
| 0.8312499999999999 | 0 |
| 0.8319444444444444 | 0 |
| 0.8326388888888889 | 0 |
| 0.8333333333333334 | 0 |
| 0.8340277777777777 | 0 |
| 0.8347222222222223 | 0 |
| 0.8354166666666667 | 0 |
| 0.8361111111111111 | 0 |
| 0.8368055555555555 | 0 |
| 0.8375 | 0 |
| 0.8381944444444445 | 0 |
| 0.8388888888888889 | 0 |
| 0.8395833333333332 | 0 |
| 0.8402777777777778 | 0 |
| 0.8409722222222222 | 0 |
| 0.8416666666666667 | 0 |
| 0.842361111111111 | 0 |
| 0.8430555555555556 | 0 |
| 0.84375 | 0 |
| 0.8444444444444444 | 0 |
| 0.845138888888889 | 0 |
| 0.8458333333333333 | 0 |
| 0.8465277777777778 | 0 |
| 0.8472222222222222 | 0 |
| 0.8479166666666668 | 0 |
| 0.8486111111111111 | 0 |
| 0.8493055555555555 | 0 |
| 0.85 | 0 |
| 0.8506944444444445 | 0 |
| 0.8513888888888889 | 0 |
| 0.8520833333333333 | 0 |
| 0.8527777777777777 | 0 |
| 0.8534722222222223 | 0 |
| 0.8541666666666666 | 0 |
| 0.8548611111111111 | 0 |
| 0.8555555555555556 | 0 |
| 0.8562500000000001 | 0 |
| 0.8569444444444444 | 0 |
| 0.8576388888888888 | 0 |
| 0.8583333333333334 | 0 |
| 0.8590277777777778 | 0 |
| 0.8597222222222222 | 0 |
| 0.8604166666666666 | 0 |
| 0.8611111111111112 | 0 |
| 0.8618055555555556 | 0 |
| 0.8624999999999999 | 0 |
| 0.8631944444444444 | 0 |
| 0.8638888888888889 | 0 |
| 0.8645833333333334 | 0 |
| 0.8652777777777777 | 0 |
| 0.8659722222222223 | 0 |
| 0.8666666666666667 | 0 |
| 0.8673611111111111 | 0 |
| 0.8680555555555555 | 0 |
| 0.86875 | 0 |
| 0.8694444444444445 | 0 |
| 0.8701388888888889 | 0 |
| 0.8708333333333332 | 0 |
| 0.8715277777777778 | 0 |
| 0.8722222222222222 | 0 |
| 0.8729166666666667 | 0 |
| 0.873611111111111 | 0 |
| 0.8743055555555556 | 0 |
| 0.875 | 0 |
| 0.8756944444444444 | 0 |
| 0.876388888888889 | 0 |
| 0.8770833333333333 | 0 |
| 0.8777777777777778 | 0 |
| 0.8784722222222222 | 0 |
| 0.8791666666666668 | 0 |
| 0.8798611111111111 | 0 |
| 0.8805555555555555 | 0 |
| 0.88125 | 0 |
| 0.8819444444444445 | 0 |
| 0.8826388888888889 | 0 |
| 0.8833333333333333 | 0 |
| 0.8840277777777777 | 0 |
| 0.8847222222222223 | 0 |
| 0.8854166666666666 | 0 |
| 0.8861111111111111 | 0 |
| 0.8868055555555556 | 0 |
| 0.8875000000000001 | 0 |
| 0.8881944444444444 | 0 |
| 0.8888888888888888 | 0 |
| 0.8895833333333334 | 0 |
| 0.8902777777777778 | 0 |
| 0.8909722222222222 | 0 |
| 0.8916666666666666 | 0 |
| 0.8923611111111112 | 0 |
| 0.8930555555555556 | 0 |
| 0.8937499999999999 | 0 |
| 0.8944444444444444 | 0 |
| 0.8951388888888889 | 0 |
| 0.8958333333333334 | 0 |
| 0.8965277777777777 | 0 |
| 0.8972222222222223 | 0 |
| 0.8979166666666667 | 0 |
| 0.8986111111111111 | 0 |
| 0.8993055555555555 | 0 |
| 0.9 | 0 |
| 0.9006944444444445 | 0 |
| 0.9013888888888889 | 0 |
| 0.9020833333333332 | 0 |
| 0.9027777777777778 | 0 |
| 0.9034722222222222 | 0 |
| 0.9041666666666667 | 0 |
| 0.904861111111111 | 0 |
| 0.9055555555555556 | 0 |
| 0.90625 | 0 |
| 0.9069444444444444 | 0 |
| 0.907638888888889 | 0 |
| 0.9083333333333333 | 0 |
| 0.9090277777777778 | 0 |
| 0.9097222222222222 | 0 |
| 0.9104166666666668 | 0 |
| 0.9111111111111111 | 0 |
| 0.9118055555555555 | 0 |
| 0.9125 | 0 |
| 0.9131944444444445 | 0 |
| 0.9138888888888889 | 0 |
| 0.9145833333333333 | 0 |
| 0.9152777777777777 | 0 |
| 0.9159722222222223 | 0 |
| 0.9166666666666666 | 0 |
| 0.9173611111111111 | 0 |
| 0.9180555555555556 | 0 |
| 0.9187500000000001 | 0 |
| 0.9194444444444444 | 0 |
| 0.9201388888888888 | 0 |
| 0.9208333333333334 | 0 |
| 0.9215277777777778 | 0 |
| 0.9222222222222222 | 0 |
| 0.9229166666666666 | 0 |
| 0.9236111111111112 | 0 |
| 0.9243055555555556 | 0 |
| 0.9249999999999999 | 0 |
| 0.9256944444444444 | 0 |
| 0.9263888888888889 | 0 |
| 0.9270833333333334 | 0 |
| 0.9277777777777777 | 0 |
| 0.9284722222222223 | 0 |
| 0.9291666666666667 | 0 |
| 0.9298611111111111 | 0 |
| 0.9305555555555555 | 0 |
| 0.93125 | 0 |
| 0.9319444444444445 | 0 |
| 0.9326388888888889 | 0 |
| 0.9333333333333332 | 0 |
| 0.9340277777777778 | 0 |
| 0.9347222222222222 | 0 |
| 0.9354166666666667 | 0 |
| 0.936111111111111 | 0 |
| 0.9368055555555556 | 0 |
| 0.9375 | 0 |
| 0.9381944444444444 | 0 |
| 0.938888888888889 | 0 |
| 0.9395833333333333 | 0 |
| 0.9402777777777778 | 0 |
| 0.9409722222222222 | 0 |
| 0.9416666666666668 | 0 |
| 0.9423611111111111 | 0 |
| 0.9430555555555555 | 0 |
| 0.94375 | 0 |
| 0.9444444444444445 | 0 |
| 0.9451388888888889 | 0 |
| 0.9458333333333333 | 0 |
| 0.9465277777777777 | 0 |
| 0.9472222222222223 | 0 |
| 0.9479166666666666 | 0 |
| 0.9486111111111111 | 0 |
| 0.9493055555555556 | 0 |
| 0.9500000000000001 | 0 |
| 0.9506944444444444 | 0 |
| 0.9513888888888888 | 0 |
| 0.9520833333333334 | 0 |
| 0.9527777777777778 | 0 |
| 0.9534722222222222 | 0 |
| 0.9541666666666666 | 0 |
| 0.9548611111111112 | 0 |
| 0.9555555555555556 | 0 |
| 0.9562499999999999 | 0 |
| 0.9569444444444444 | 0 |
| 0.9576388888888889 | 0 |
| 0.9583333333333334 | 0 |
| 0.9590277777777777 | 0 |
| 0.9597222222222223 | 0 |
| 0.9604166666666667 | 0 |
| 0.9611111111111111 | 0 |
| 0.9618055555555555 | 0 |
| 0.9625 | 0 |
| 0.9631944444444445 | 0 |
| 0.9638888888888889 | 0 |
| 0.9645833333333332 | 0 |
| 0.9652777777777778 | 0 |
| 0.9659722222222222 | 0 |
| 0.9666666666666667 | 0 |
| 0.967361111111111 | 0 |
| 0.9680555555555556 | 0 |
| 0.96875 | 0 |
| 0.9694444444444444 | 0 |
| 0.970138888888889 | 0 |
| 0.9708333333333333 | 0 |
| 0.9715277777777778 | 0 |
| 0.9722222222222222 | 0 |
| 0.9729166666666668 | 0 |
| 0.9736111111111111 | 0 |
| 0.9743055555555555 | 0 |
| 0.975 | 0 |
| 0.9756944444444445 | 0 |
| 0.9763888888888889 | 0 |
| 0.9770833333333333 | 0 |
| 0.9777777777777777 | 0 |
| 0.9784722222222223 | 0 |
| 0.9791666666666666 | 0 |
| 0.9798611111111111 | 0 |
| 0.9805555555555556 | 0 |
| 0.9812500000000001 | 0 |
| 0.9819444444444444 | 0 |
| 0.9826388888888888 | 0 |
| 0.9833333333333334 | 0 |
| 0.9840277777777778 | 0 |
| 0.9847222222222222 | 0 |
| 0.9854166666666666 | 0 |
| 0.9861111111111112 | 0 |
| 0.9868055555555556 | 0 |
| 0.9874999999999999 | 0 |
| 0.9881944444444444 | 0 |
| 0.9888888888888889 | 0 |
| 0.9895833333333334 | 0 |
| 0.9902777777777777 | 0 |
| 0.9909722222222223 | 0 |
| 0.9916666666666667 | 0 |
| 0.9923611111111111 | 0 |
| 0.9930555555555555 | 0 |
| 0.99375 | 0 |
| 0.9944444444444445 | 0 |
| 0.9951388888888889 | 0 |
| 0.9958333333333332 | 0 |
| 0.9965277777777778 | 0 |
| 0.9972222222222222 | 0 |
| 0.9979166666666667 | 0 |
| 0.998611111111111 | 0 |
| 0.9993055555555556 | 0 |